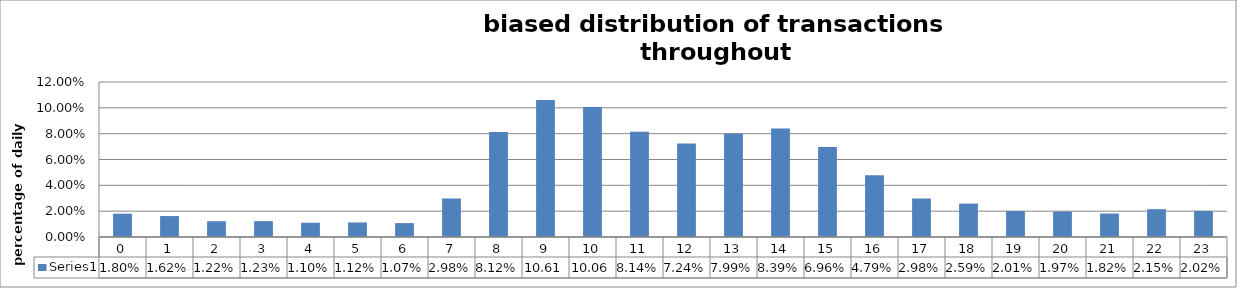
| Category | Series 0 |
|---|---|
| 0.0 | 0.018 |
| 1.0 | 0.016 |
| 2.0 | 0.012 |
| 3.0 | 0.012 |
| 4.0 | 0.011 |
| 5.0 | 0.011 |
| 6.0 | 0.011 |
| 7.0 | 0.03 |
| 8.0 | 0.081 |
| 9.0 | 0.106 |
| 10.0 | 0.101 |
| 11.0 | 0.081 |
| 12.0 | 0.072 |
| 13.0 | 0.08 |
| 14.0 | 0.084 |
| 15.0 | 0.07 |
| 16.0 | 0.048 |
| 17.0 | 0.03 |
| 18.0 | 0.026 |
| 19.0 | 0.02 |
| 20.0 | 0.02 |
| 21.0 | 0.018 |
| 22.0 | 0.022 |
| 23.0 | 0.02 |